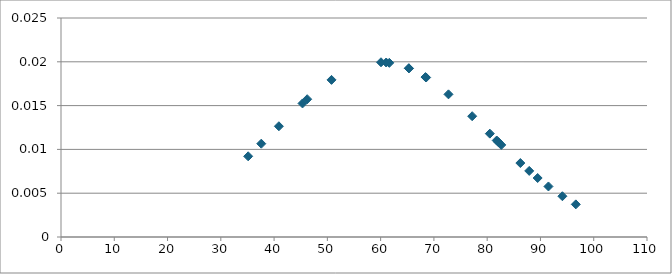
| Category | Series 0 |
|---|---|
| 60.06676764950894 | 0.02 |
| 72.73574635077017 | 0.016 |
| 68.54444510365818 | 0.018 |
| 80.49738459329572 | 0.012 |
| 35.13754444970826 | 0.009 |
| 46.2150730452386 | 0.016 |
| 87.89151333588488 | 0.008 |
| 82.1206061744318 | 0.011 |
| 86.22625127633474 | 0.008 |
| 96.6366558366352 | 0.004 |
| 94.1201177297053 | 0.005 |
| 68.4171445529492 | 0.018 |
| 91.50195897262392 | 0.006 |
| 61.04287825539101 | 0.02 |
| 89.47265546878232 | 0.007 |
| 65.31715586521098 | 0.019 |
| 61.63010399126604 | 0.02 |
| 50.78068370732434 | 0.018 |
| 81.7933684470527 | 0.011 |
| 77.18711093919552 | 0.014 |
| 40.899954437036264 | 0.013 |
| 65.28831027099929 | 0.019 |
| 82.64421239174304 | 0.011 |
| 45.33425217768993 | 0.015 |
| 37.596096753983744 | 0.011 |